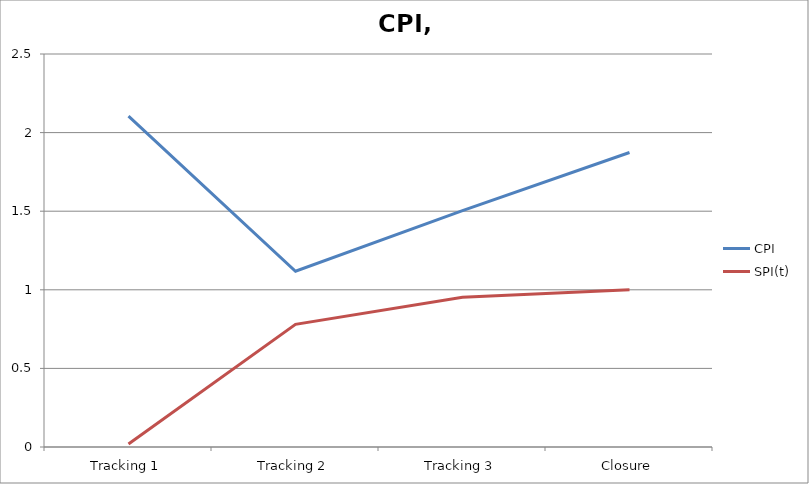
| Category | CPI | SPI(t) |
|---|---|---|
| Tracking 1 | 2.105 | 0.019 |
| Tracking 2 | 1.118 | 0.78 |
| Tracking 3 | 1.504 | 0.953 |
| Closure | 1.874 | 1.001 |